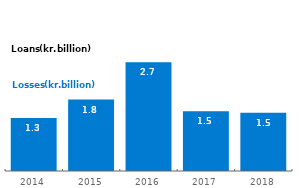
| Category | #REF! |
|---|---|
| 2014.0 | 1.337 |
| 2015.0 | 1.801 |
| 2016.0 | 2.739 |
| 2017.0 | 1.509 |
| 2018.0 | 1.467 |